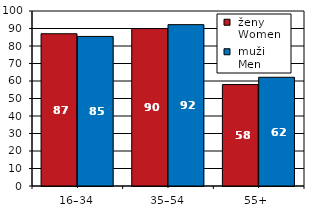
| Category |  ženy 
 Women |  muži 
 Men |
|---|---|---|
| 16–34 | 87.007 | 85.466 |
| 35–54 | 89.961 | 92.204 |
| 55+  | 57.969 | 62.132 |